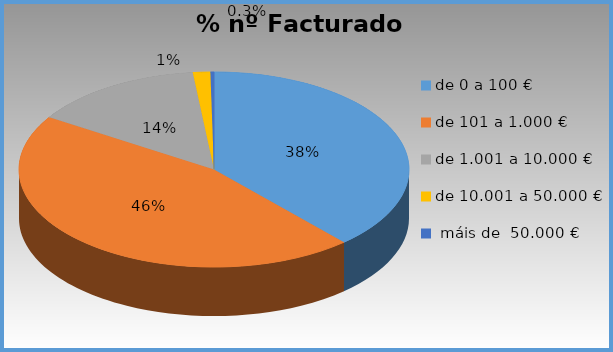
| Category | Series 0 |
|---|---|
| de 0 a 100 € | 0.384 |
| de 101 a 1.000 € | 0.456 |
| de 1.001 a 10.000 € | 0.143 |
| de 10.001 a 50.000 € | 0.014 |
|  máis de  50.000 € | 0.003 |